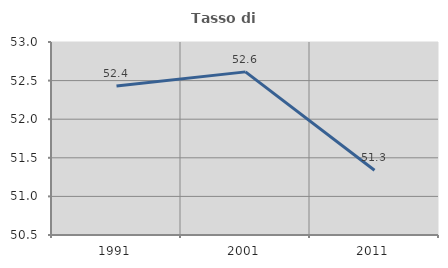
| Category | Tasso di occupazione   |
|---|---|
| 1991.0 | 52.429 |
| 2001.0 | 52.613 |
| 2011.0 | 51.339 |